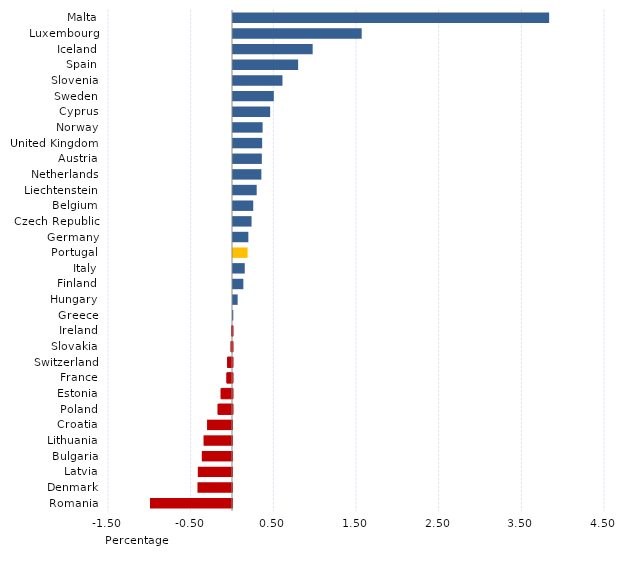
| Category | Series 0 |
|---|---|
| Malta | 3.824 |
| Luxembourg | 1.557 |
| Iceland | 0.964 |
| Spain | 0.788 |
| Slovenia | 0.598 |
| Sweden | 0.494 |
| Cyprus | 0.449 |
| Norway | 0.358 |
| United Kingdom | 0.353 |
| Austria | 0.349 |
| Netherlands | 0.343 |
| Liechtenstein | 0.287 |
| Belgium | 0.245 |
| Czech Republic | 0.225 |
| Germany | 0.186 |
| Portugal | 0.176 |
| Italy | 0.142 |
| Finland | 0.125 |
| Hungary | 0.056 |
| Greece | 0.003 |
| Ireland | -0.009 |
| Slovakia | -0.016 |
| Switzerland | -0.059 |
| France | -0.067 |
| Estonia | -0.136 |
| Poland | -0.173 |
| Croatia | -0.302 |
| Lithuania | -0.344 |
| Bulgaria | -0.365 |
| Latvia | -0.413 |
| Denmark | -0.418 |
| Romania | -0.992 |